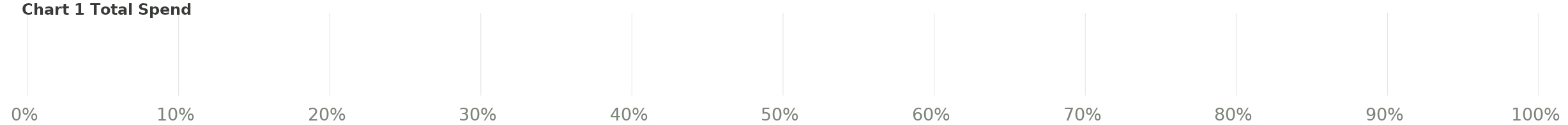
| Category | -3 | -2 | -1 | 1 | 2 | 3 |
|---|---|---|---|---|---|---|
| 0 | 0 | 0 | 0 | 0 | 0 | 0 |